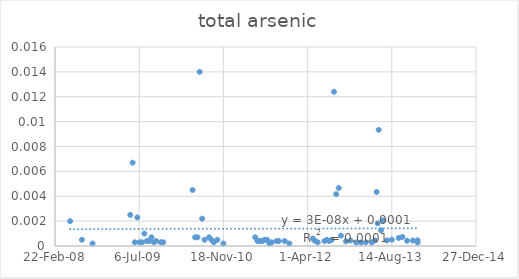
| Category | Series 0 |
|---|---|
| 39590.0 | 0.002 |
| 39660.0 | 0 |
| 39723.0 | 0 |
| 39947.0 | 0.002 |
| 39961.0 | 0.007 |
| 39974.0 | 0 |
| 39989.0 | 0.002 |
| 40002.0 | 0 |
| 40017.0 | 0 |
| 40031.0 | 0.001 |
| 40045.0 | 0 |
| 40059.0 | 0 |
| 40073.0 | 0.001 |
| 40087.0 | 0 |
| 40101.0 | 0 |
| 40129.0 | 0 |
| 40143.0 | 0 |
| 40317.0 | 0.004 |
| 40332.0 | 0.001 |
| 40346.0 | 0.001 |
| 40359.0 | 0.014 |
| 40374.0 | 0.002 |
| 40388.0 | 0 |
| 40415.0 | 0.001 |
| 40429.0 | 0 |
| 40443.0 | 0 |
| 40464.0 | 0 |
| 40500.0 | 0 |
| 40689.0 | 0.001 |
| 40702.0 | 0 |
| 40717.0 | 0 |
| 40731.0 | 0 |
| 40745.0 | 0 |
| 40759.0 | 0 |
| 40773.0 | 0 |
| 40787.0 | 0 |
| 40815.0 | 0 |
| 40829.0 | 0 |
| 40864.0 | 0 |
| 40892.0 | 0 |
| 41031.0 | 0.001 |
| 41045.0 | 0 |
| 41060.0 | 0 |
| 41100.0 | 0 |
| 41114.0 | 0 |
| 41128.0 | 0 |
| 41143.0 | 0 |
| 41157.0 | 0.012 |
| 41170.0 | 0.004 |
| 41185.0 | 0.005 |
| 41198.0 | 0.001 |
| 41228.0 | 0 |
| 41255.0 | 0 |
| 41289.0 | 0 |
| 41317.0 | 0 |
| 41345.0 | 0 |
| 41381.0 | 0 |
| 41401.0 | 0 |
| 41410.0 | 0.004 |
| 41416.0 | 0.002 |
| 41422.0 | 0.009 |
| 41436.0 | 0.001 |
| 41450.0 | 0.002 |
| 41471.0 | 0 |
| 41500.0 | 0.001 |
| 41541.0 | 0.001 |
| 41563.0 | 0.001 |
| 41591.0 | 0 |
| 41625.0 | 0 |
| 41653.0 | 0 |
| 41653.0 | 0 |